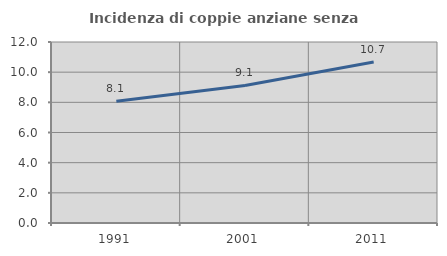
| Category | Incidenza di coppie anziane senza figli  |
|---|---|
| 1991.0 | 8.066 |
| 2001.0 | 9.118 |
| 2011.0 | 10.673 |